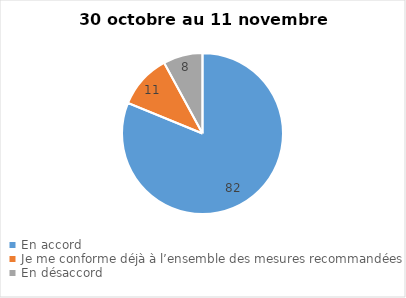
| Category | Series 0 |
|---|---|
| En accord | 82 |
| Je me conforme déjà à l’ensemble des mesures recommandées | 11 |
| En désaccord | 8 |